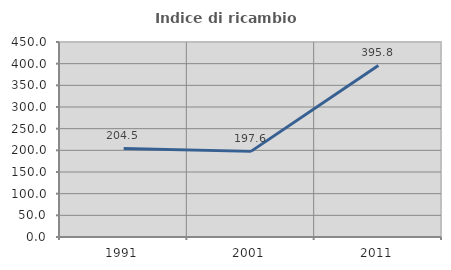
| Category | Indice di ricambio occupazionale  |
|---|---|
| 1991.0 | 204.508 |
| 2001.0 | 197.596 |
| 2011.0 | 395.798 |